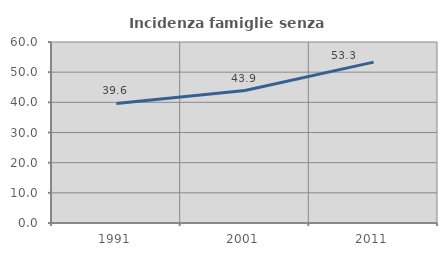
| Category | Incidenza famiglie senza nuclei |
|---|---|
| 1991.0 | 39.631 |
| 2001.0 | 43.905 |
| 2011.0 | 53.325 |